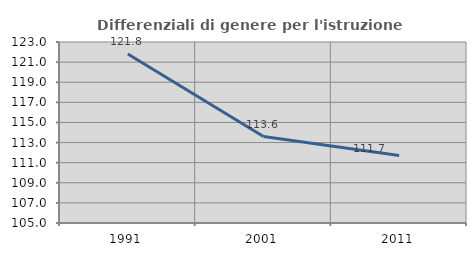
| Category | Differenziali di genere per l'istruzione superiore |
|---|---|
| 1991.0 | 121.801 |
| 2001.0 | 113.602 |
| 2011.0 | 111.706 |